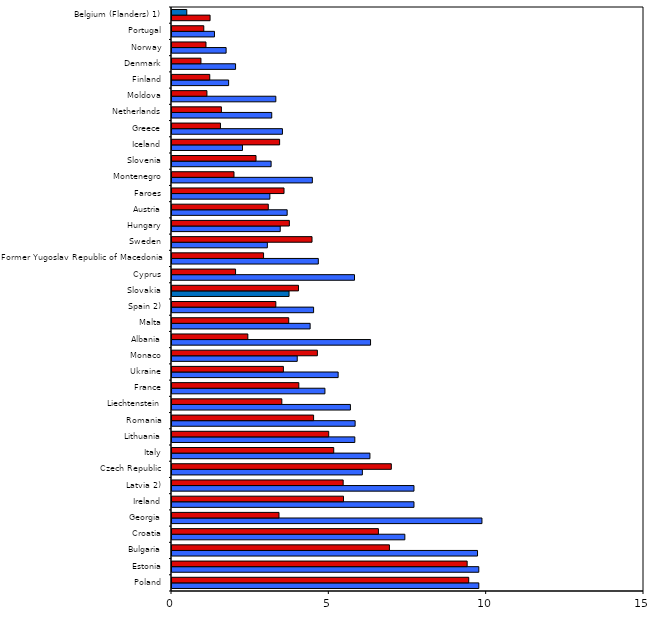
| Category | Boys | Girls |
|---|---|---|
| Poland | 9.75 | 9.43 |
| Estonia | 9.75 | 9.38 |
| Bulgaria | 9.71 | 6.91 |
| Croatia | 7.4 | 6.56 |
| Georgia | 9.85 | 3.4 |
| Ireland | 7.69 | 5.45 |
| Latvia 2) | 7.69 | 5.44 |
| Czech Republic | 6.05 | 6.97 |
| Italy | 6.29 | 5.14 |
| Lithuania | 5.81 | 4.98 |
| Romania | 5.82 | 4.5 |
| Liechtenstein | 5.67 | 3.49 |
| France | 4.86 | 4.03 |
| Ukraine | 5.28 | 3.54 |
| Monaco | 3.98 | 4.62 |
| Albania | 6.31 | 2.41 |
| Malta | 4.39 | 3.71 |
| Spain 2) | 4.5 | 3.3 |
| Slovakia | 3.72 | 4.02 |
| Cyprus | 5.8 | 2.02 |
| Former Yugoslav Republic of Macedonia | 4.65 | 2.91 |
| Sweden | 3.03 | 4.45 |
| Hungary | 3.44 | 3.73 |
| Austria | 3.66 | 3.06 |
| Faroes | 3.11 | 3.56 |
| Montenegro | 4.46 | 1.97 |
| Slovenia | 3.15 | 2.67 |
| Iceland | 2.24 | 3.42 |
| Greece | 3.51 | 1.54 |
| Netherlands | 3.17 | 1.57 |
| Moldova | 3.3 | 1.11 |
| Finland | 1.8 | 1.2 |
| Denmark | 2.02 | 0.92 |
| Norway | 1.72 | 1.08 |
| Portugal | 1.35 | 1.01 |
| Belgium (Flanders) 1) | 1.21 | 0.47 |